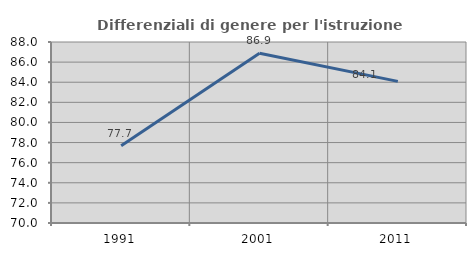
| Category | Differenziali di genere per l'istruzione superiore |
|---|---|
| 1991.0 | 77.689 |
| 2001.0 | 86.878 |
| 2011.0 | 84.082 |